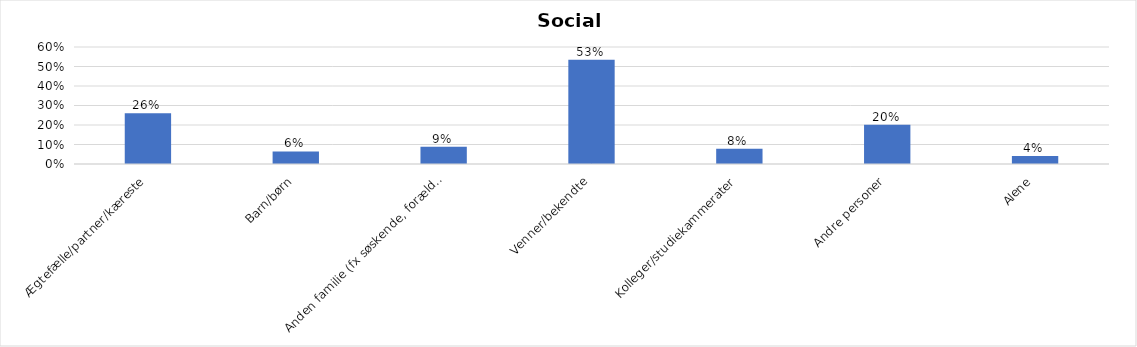
| Category | % |
|---|---|
| Ægtefælle/partner/kæreste | 0.261 |
| Barn/børn | 0.064 |
| Anden familie (fx søskende, forældre) | 0.089 |
| Venner/bekendte | 0.534 |
| Kolleger/studiekammerater | 0.078 |
| Andre personer | 0.201 |
| Alene | 0.041 |